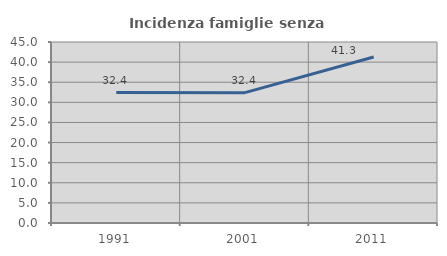
| Category | Incidenza famiglie senza nuclei |
|---|---|
| 1991.0 | 32.432 |
| 2001.0 | 32.407 |
| 2011.0 | 41.264 |